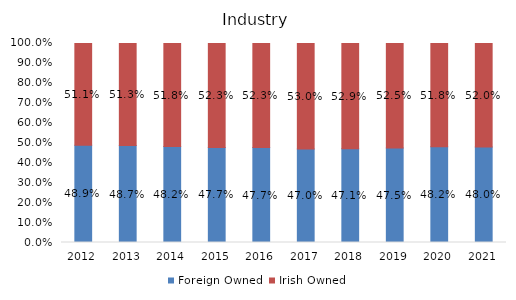
| Category | Foreign Owned | Irish Owned |
|---|---|---|
| 2012.0 | 0.489 | 0.511 |
| 2013.0 | 0.487 | 0.513 |
| 2014.0 | 0.482 | 0.518 |
| 2015.0 | 0.477 | 0.523 |
| 2016.0 | 0.477 | 0.523 |
| 2017.0 | 0.47 | 0.53 |
| 2018.0 | 0.471 | 0.529 |
| 2019.0 | 0.475 | 0.525 |
| 2020.0 | 0.482 | 0.518 |
| 2021.0 | 0.48 | 0.52 |